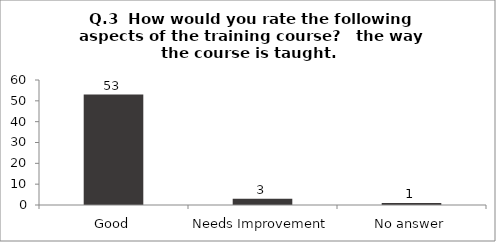
| Category | Q.3  How would you rate the following aspects of the training course?  |
|---|---|
| Good | 53 |
| Needs Improvement | 3 |
| No answer | 1 |